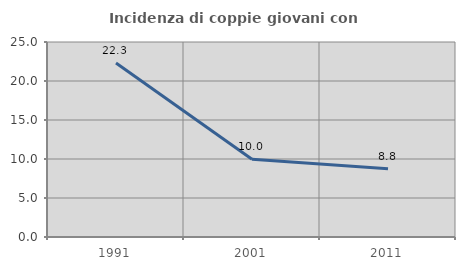
| Category | Incidenza di coppie giovani con figli |
|---|---|
| 1991.0 | 22.306 |
| 2001.0 | 9.976 |
| 2011.0 | 8.75 |